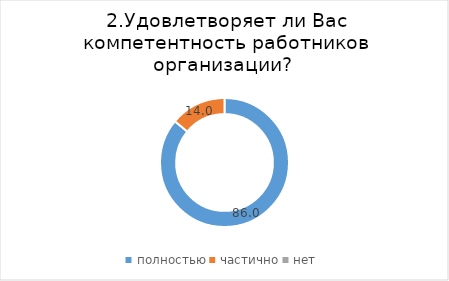
| Category | Series 0 |
|---|---|
| полностью | 86.047 |
| частично | 13.953 |
| нет | 0 |